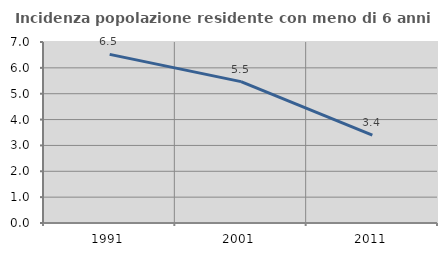
| Category | Incidenza popolazione residente con meno di 6 anni |
|---|---|
| 1991.0 | 6.522 |
| 2001.0 | 5.469 |
| 2011.0 | 3.4 |